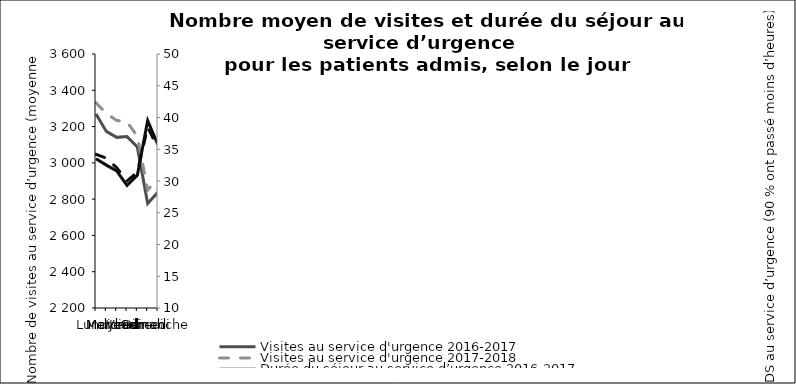
| Category | Visites au service d'urgence 2016-2017 | Visites au service d'urgence 2017-2018 |
|---|---|---|
| Lundi | 3269.77 | 3330.92 |
| Mardi | 3173.42 | 3272.13 |
| Mercredi | 3140.52 | 3233.83 |
| Jeudi | 3144.62 | 3225.9 |
| Vendredi | 3087.92 | 3147.08 |
| Samedi | 2776.52 | 2849.89 |
| Dimanche | 2838.96 | 2913 |